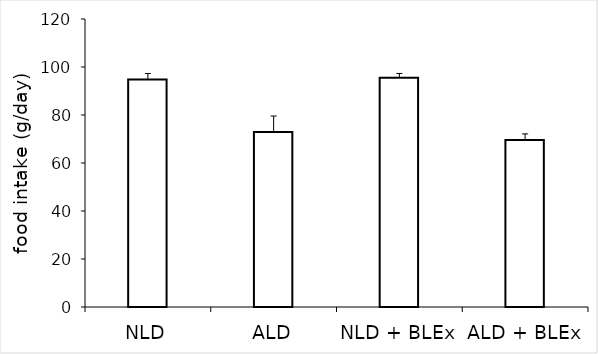
| Category | Series 0 |
|---|---|
| NLD | 94.822 |
| ALD | 72.968 |
| NLD + BLEx | 95.543 |
| ALD + BLEx | 69.582 |